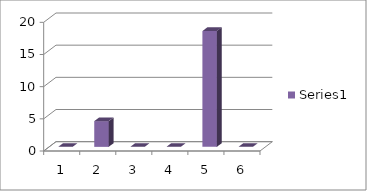
| Category | Series 0 |
|---|---|
| 0 | 0 |
| 1 | 4 |
| 2 | 0 |
| 3 | 0 |
| 4 | 18 |
| 5 | 0 |